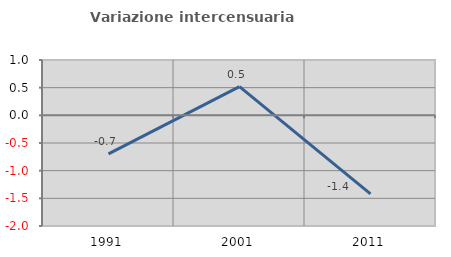
| Category | Variazione intercensuaria annua |
|---|---|
| 1991.0 | -0.696 |
| 2001.0 | 0.52 |
| 2011.0 | -1.421 |